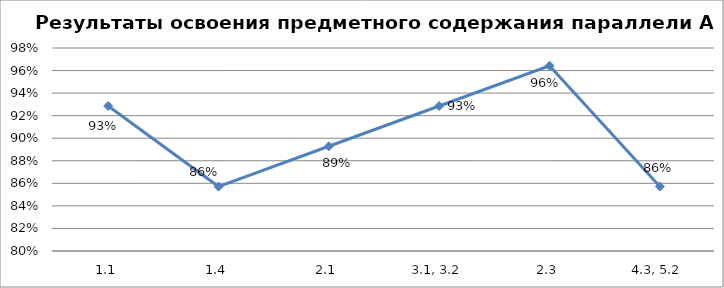
| Category | Series 0 | Медина |
|---|---|---|
| 1.1 | 0.929 |  |
| 1.4 | 0.857 |  |
| 2.1 | 0.893 |  |
| 3.1, 3.2 | 0.929 |  |
| 2.3 | 0.964 |  |
| 4.3, 5.2 | 0.857 |  |